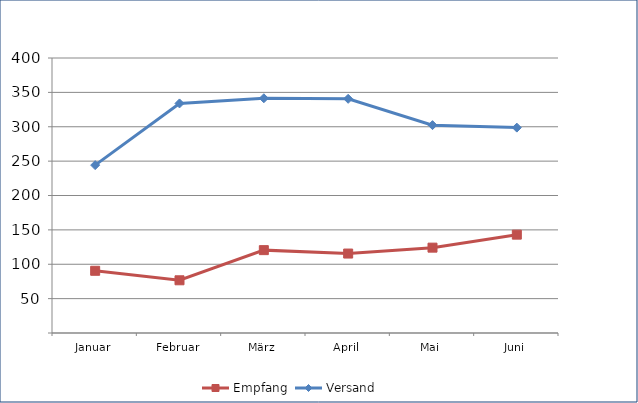
| Category | Empfang | Versand |
|---|---|---|
| Januar | 90.486 | 244.19 |
| Februar | 76.676 | 333.929 |
| März | 120.534 | 341.445 |
| April | 115.564 | 340.62 |
| Mai | 124.15 | 302.35 |
| Juni | 143.051 | 298.739 |